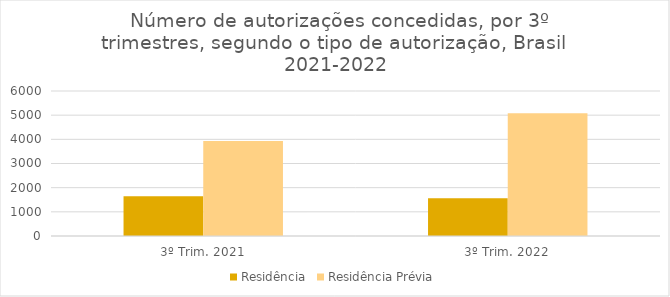
| Category | Residência | Residência Prévia |
|---|---|---|
| 3º Trim. 2021 | 1645 | 3933 |
| 3º Trim. 2022 | 1562 | 5075 |